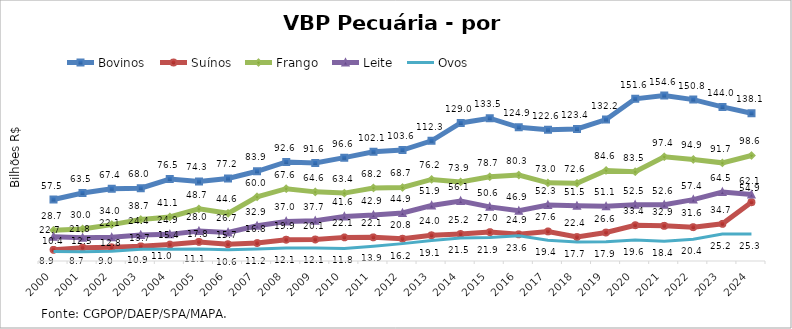
| Category | Bovinos | Suínos | Frango | Leite | Ovos |
|---|---|---|---|---|---|
| 2000 | 57.468 | 10.405 | 28.706 | 22.699 | 8.875 |
| 2001 | 63.525 | 12.484 | 29.958 | 21.843 | 8.746 |
| 2002 | 67.412 | 12.795 | 34.019 | 22.118 | 9.011 |
| 2003 | 68.037 | 13.674 | 38.728 | 24.357 | 10.899 |
| 2004 | 76.549 | 15.374 | 41.149 | 24.894 | 11.047 |
| 2005 | 74.318 | 17.825 | 48.703 | 27.998 | 11.122 |
| 2006 | 77.161 | 15.68 | 44.557 | 26.743 | 10.565 |
| 2007 | 83.856 | 16.766 | 59.99 | 32.877 | 11.228 |
| 2008 | 92.587 | 19.853 | 67.591 | 36.984 | 12.126 |
| 2009 | 91.621 | 20.068 | 64.609 | 37.706 | 12.091 |
| 2010 | 96.596 | 22.077 | 63.448 | 41.641 | 11.759 |
| 2011 | 102.117 | 22.112 | 68.247 | 42.927 | 13.857 |
| 2012 | 103.64 | 20.762 | 68.728 | 44.857 | 16.243 |
| 2013 | 112.309 | 24.039 | 76.248 | 51.908 | 19.104 |
| 2014 | 129.022 | 25.249 | 73.907 | 56.054 | 21.464 |
| 2015 | 133.463 | 26.983 | 78.671 | 50.598 | 21.855 |
| 2016 | 124.927 | 24.902 | 80.293 | 46.949 | 23.561 |
| 2017 | 122.594 | 27.643 | 73.031 | 52.311 | 19.42 |
| 2018 | 123.416 | 22.387 | 72.606 | 51.534 | 17.66 |
| 2019 | 132.151 | 26.61 | 84.612 | 51.056 | 17.885 |
| 2020 | 151.586 | 33.448 | 83.457 | 52.493 | 19.641 |
| 2021 | 154.578 | 32.852 | 97.402 | 52.551 | 18.406 |
| 2022 | 150.835 | 31.633 | 94.935 | 57.375 | 20.422 |
| 2023 | 144.003 | 34.724 | 91.733 | 64.518 | 25.164 |
| 2024 | 138.102 | 54.948 | 98.614 | 62.086 | 25.312 |